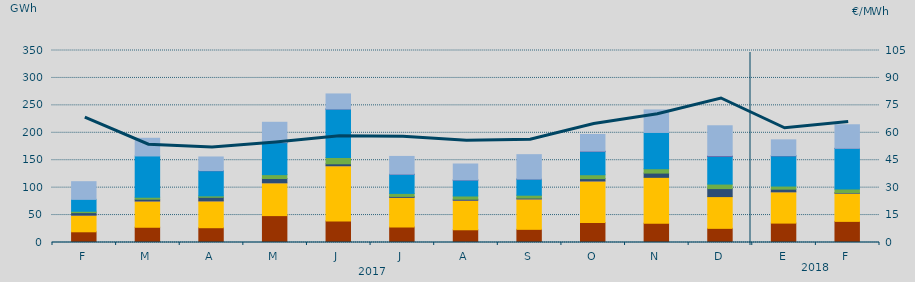
| Category | Carbón | Ciclo Combinado | Cogeneración | Consumo Bombeo | Eólica | Fuel-Gas | Hidráulica | Nuclear | Turbinación bombeo |
|---|---|---|---|---|---|---|---|---|---|
| F | 19518.4 | 30319.3 | 9.6 | 4595.7 | 2486.3 | 0 | 21689.9 | 0 | 32220.5 |
| M | 27782.8 | 47861.9 | 30.1 | 3279.6 | 3494.1 | 0 | 75296.7 | 0 | 32248 |
| A | 26944.8 | 48899.3 | 13.6 | 6553.1 | 2541.5 | 0 | 45882.6 | 122 | 24942.1 |
| M | 49018.7 | 59814.3 | 7.3 | 7845.9 | 7018.8 | 0 | 58284.6 | 169.5 | 36979 |
| J | 39223.4 | 100710.5 | 17.3 | 3498.8 | 11518.7 | 0 | 88256.3 | 69.8 | 27501.3 |
| J | 28227.7 | 53992.1 | 2.7 | 1736.9 | 5554.8 | 0 | 34688.7 | 310 | 32397.1 |
| A | 23185.3 | 53888.3 | 1.1 | 1823.4 | 5883.3 | 0 | 29023.6 | 148 | 29140 |
| S | 23990.4 | 55429.2 | 0.8 | 1551.4 | 5247.3 | 0 | 29358.5 | 3.1 | 44532.5 |
| O | 36235.6 | 75955.4 | 2 | 4285.9 | 7050.1 | 0 | 42190.9 | 700 | 30549.8 |
| N | 35124.9 | 83653.4 | 0 | 7774.4 | 7943.5 | 0 | 66112.3 | 0 | 41077.1 |
| D | 25784.6 | 57877.3 | 0 | 14602.9 | 8236.4 | 0 | 50297.7 | 1085.4 | 54906.6 |
| E | 35353.2 | 57056.1 | 10.8 | 4781.6 | 5669.6 | 0 | 55012.6 | 282.3 | 28937.8 |
| F | 38501.6 | 51366.4 | 3 | 876.5 | 6719.4 | 0 | 74091.8 | 129.7 | 42931.7 |